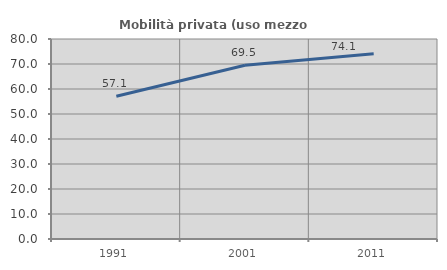
| Category | Mobilità privata (uso mezzo privato) |
|---|---|
| 1991.0 | 57.074 |
| 2001.0 | 69.469 |
| 2011.0 | 74.083 |